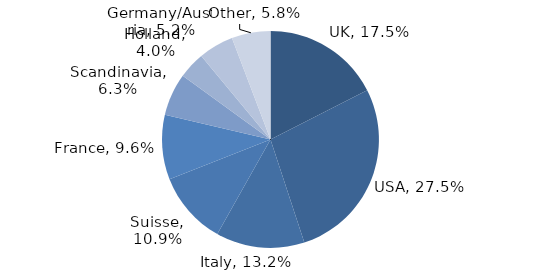
| Category | Investment Style |
|---|---|
| UK | 0.175 |
| USA | 0.275 |
| Italy | 0.132 |
| Suisse | 0.109 |
| France | 0.096 |
| Scandinavia | 0.063 |
| Holland | 0.04 |
| Germany/Austria | 0.052 |
| Other | 0.058 |